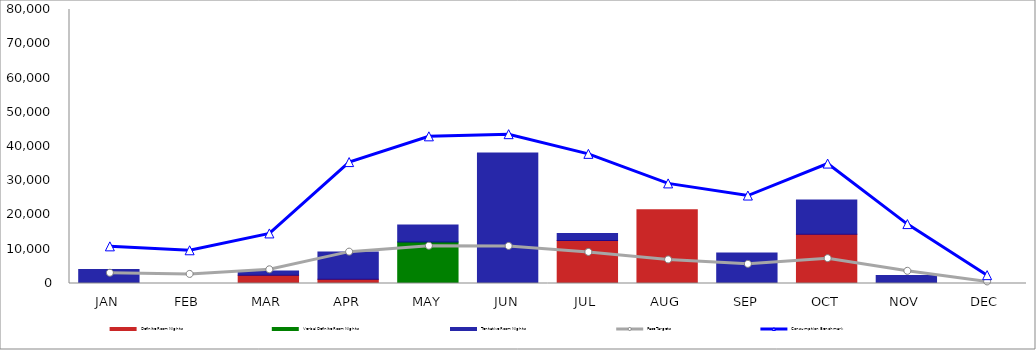
| Category | Definite Room Nights | Verbal Definite Room Nights | Tentative Room Nights |
|---|---|---|---|
| JAN | 0 | 0 | 4088 |
| FEB | 0 | 0 | 0 |
| MAR | 2400 | 0 | 1232 |
| APR | 1205 | 0 | 8007 |
| MAY | 0 | 12090 | 4995 |
| JUN | 0 | 0 | 38110 |
| JUL | 12546 | 0 | 2038 |
| AUG | 21550 | 0 | 0 |
| SEP | 0 | 0 | 8917 |
| OCT | 14355 | 0 | 10022 |
| NOV | 0 | 0 | 2316 |
| DEC | 0 | 0 | 0 |